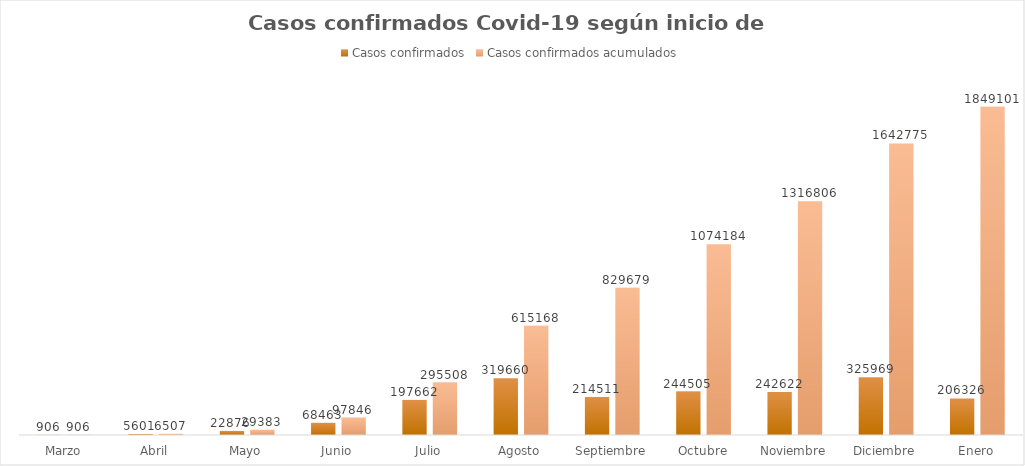
| Category | Casos confirmados | Casos confirmados acumulados |
|---|---|---|
| Marzo | 906 | 906 |
| Abril | 5601 | 6507 |
| Mayo | 22876 | 29383 |
| Junio | 68463 | 97846 |
| Julio | 197662 | 295508 |
| Agosto | 319660 | 615168 |
| Septiembre | 214511 | 829679 |
| Octubre | 244505 | 1074184 |
| Noviembre | 242622 | 1316806 |
| Diciembre | 325969 | 1642775 |
| Enero | 206326 | 1849101 |